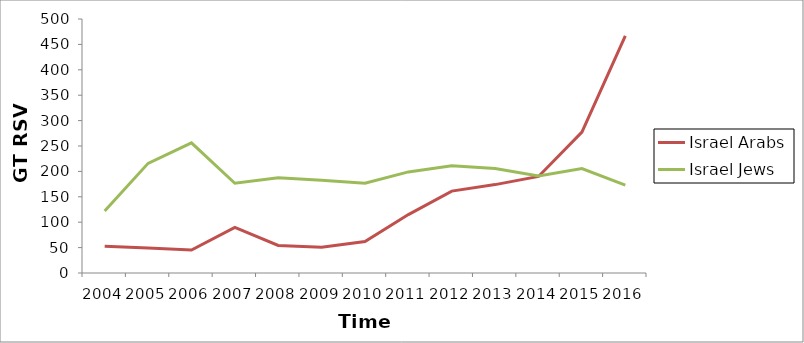
| Category | Israel Arabs | Israel Jews |
|---|---|---|
| 2004.0 | 52.429 | 121.833 |
| 2005.0 | 49 | 215.833 |
| 2006.0 | 45.143 | 256.167 |
| 2007.0 | 89.714 | 176.667 |
| 2008.0 | 54.143 | 187.333 |
| 2009.0 | 50.571 | 182.5 |
| 2010.0 | 62 | 176.667 |
| 2011.0 | 115 | 199 |
| 2012.0 | 161.143 | 211 |
| 2013.0 | 174 | 205.833 |
| 2014.0 | 190 | 191.167 |
| 2015.0 | 277.429 | 205.667 |
| 2016.0 | 467 | 173 |